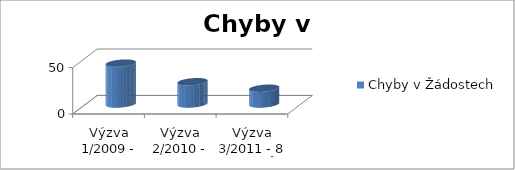
| Category | Chyby v Žádostech |
|---|---|
| Výzva 1/2009 - 19 projektů | 44 |
| Výzva 2/2010 - 22 projektů  | 24 |
| Výzva 3/2011 - 8 projektů  | 17 |